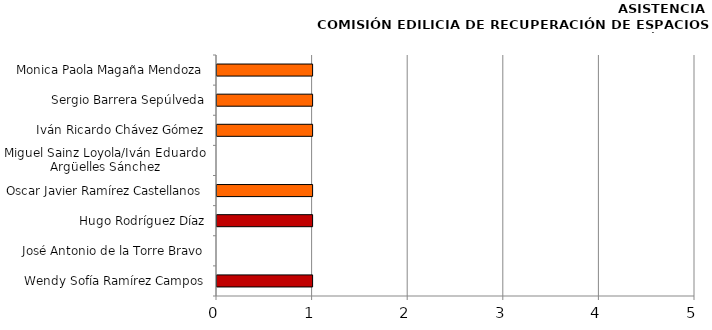
| Category | Series 0 |
|---|---|
| Wendy Sofía Ramírez Campos | 1 |
| José Antonio de la Torre Bravo | 0 |
| Hugo Rodríguez Díaz | 1 |
| Oscar Javier Ramírez Castellanos | 1 |
| Miguel Sainz Loyola/Iván Eduardo Argüelles Sánchez | 0 |
| Iván Ricardo Chávez Gómez | 1 |
| Sergio Barrera Sepúlveda | 1 |
| Monica Paola Magaña Mendoza | 1 |